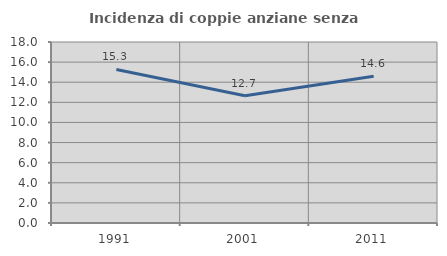
| Category | Incidenza di coppie anziane senza figli  |
|---|---|
| 1991.0 | 15.274 |
| 2001.0 | 12.652 |
| 2011.0 | 14.604 |